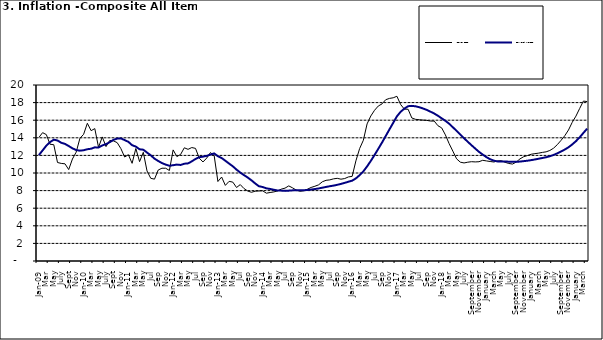
| Category | Year-on Rate | 12-Month Average |
|---|---|---|
| Jan-09 | 14.034 | 12.032 |
| Feb | 14.584 | 12.567 |
| Mar | 14.366 | 13.101 |
| Apr | 13.268 | 13.51 |
| May | 13.212 | 13.787 |
| June | 11.194 | 13.694 |
| July | 11.09 | 13.437 |
| Aug | 11.046 | 13.307 |
| Sept | 10.39 | 13.065 |
| Oct | 11.588 | 12.803 |
| Nov | 12.368 | 12.609 |
| Dec | 13.93 | 12.538 |
| Jan-10 | 14.398 | 12.586 |
| Feb | 15.649 | 12.7 |
| Mar | 14.812 | 12.757 |
| Apr | 15.044 | 12.915 |
| May | 12.915 | 12.893 |
| June | 14.099 | 13.132 |
| July | 13.002 | 13.284 |
| Aug | 13.702 | 13.5 |
| Sept | 13.65 | 13.764 |
| Oct | 13.45 | 13.908 |
| Nov | 12.766 | 13.928 |
| Dec | 11.815 | 13.74 |
| Jan-11 | 12.08 | 13.542 |
| Feb | 11.1 | 13.161 |
| Mar | 12.779 | 13.001 |
| Apr | 11.291 | 12.694 |
| May | 12.352 | 12.648 |
| Jun | 10.23 | 12.321 |
| Jul | 9.397 | 12.009 |
| Aug | 9.301 | 11.635 |
| Sep | 10.339 | 11.363 |
| Oct | 10.544 | 11.13 |
| Nov | 10.54 | 10.952 |
| Dec | 10.283 | 10.826 |
| Jan-12 | 12.626 | 10.886 |
| Feb | 11.866 | 10.955 |
| Mar | 12.111 | 10.914 |
| Apr | 12.866 | 11.054 |
| May | 12.688 | 11.096 |
| Jun | 12.892 | 11.32 |
| Jul | 12.797 | 11.599 |
| Aug | 11.689 | 11.791 |
| Sep | 11.253 | 11.859 |
| Oct | 11.693 | 11.948 |
| Nov | 12.32 | 12.091 |
| Dec | 11.981 | 12.224 |
| Jan-13 | 9.031 | 11.908 |
| Feb | 9.542 | 11.703 |
| Mar | 8.593 | 11.394 |
| Apr | 9.052 | 11.072 |
| May | 8.964 | 10.761 |
| Jun | 8.353 | 10.383 |
| Jul | 8.682 | 10.047 |
| Aug | 8.231 | 9.761 |
| Sep | 7.952 | 9.486 |
| Oct | 7.807 | 9.167 |
| Nov | 7.931 | 8.815 |
| Dec | 7.957 | 8.496 |
| Jan-14 | 7.977 | 8.408 |
| Feb | 7.707 | 8.257 |
| Mar | 7.783 | 8.19 |
| Apr | 7.851 | 8.092 |
| May | 7.965 | 8.012 |
| Jun | 8.167 | 7.998 |
| Jul | 8.281 | 7.968 |
| Aug | 8.534 | 7.996 |
| Sep | 8.317 | 8.027 |
| Oct | 8.06 | 8.047 |
| Nov | 7.927 | 8.046 |
| Dec | 7.978 | 8.047 |
| Jan-15 | 8.157 | 8.063 |
| Feb | 8.359 | 8.117 |
| Mar | 8.494 | 8.176 |
| Apr | 8.655 | 8.243 |
| May | 9.003 | 8.331 |
| Jun | 9.168 | 8.417 |
| Jul | 9.218 | 8.497 |
| Aug | 9.336 | 8.566 |
| Sep | 9.394 | 8.658 |
| Oct | 9.296 | 8.76 |
| Nov | 9.368 | 8.879 |
| Dec | 9.554 | 9.009 |
| Jan-16 | 9.617 | 9.13 |
| Feb | 11.379 | 9.386 |
| Mar | 12.775 | 9.751 |
| Apr | 13.721 | 10.182 |
| May | 15.577 | 10.746 |
| Jun | 16.48 | 11.372 |
| Jul | 17.127 | 12.045 |
| Aug | 17.609 | 12.744 |
| Sep | 17.852 | 13.454 |
| Oct | 18.33 | 14.206 |
| Nov | 18.476 | 14.958 |
| Dec | 18.547 | 15.697 |
| Jan-17 | 18.719 | 16.441 |
| Feb | 17.78 | 16.958 |
| Mar | 17.256 | 17.315 |
| Apr | 17.244 | 17.591 |
| May | 16.251 | 17.628 |
| Jun | 16.098 | 17.578 |
| Jul | 16.053 | 17.475 |
| Aug | 16.012 | 17.331 |
| Sep | 15.979 | 17.17 |
| Oct | 15.905 | 16.968 |
| Nov | 15.901 | 16.76 |
| Dec | 15.372 | 16.502 |
| Jan-18 | 15.127 | 16.215 |
| Feb | 14.33 | 15.93 |
| Mar | 13.337 | 15.599 |
| Apr | 12.482 | 15.196 |
| May | 11.608 | 14.793 |
| June | 11.231 | 14.371 |
| July | 11.142 | 13.95 |
| August | 11.227 | 13.546 |
| September | 11.284 | 13.157 |
| October | 11.259 | 12.777 |
| November | 11.281 | 12.406 |
| December | 11.442 | 12.095 |
| January | 11.374 | 11.801 |
| February | 11.306 | 11.564 |
| March | 11.251 | 11.401 |
| April | 11.372 | 11.314 |
| May | 11.396 | 11.299 |
| June | 11.217 | 11.297 |
| July | 11.084 | 11.291 |
| August | 11.016 | 11.271 |
| September | 11.244 | 11.268 |
| October | 11.607 | 11.298 |
| November | 11.854 | 11.348 |
| December | 11.982 | 11.396 |
| January | 12.132 | 11.462 |
| February | 12.199 | 11.539 |
| March | 12.257 | 11.624 |
| April | 12.341 | 11.706 |
| May | 12.404 | 11.791 |
| June | 12.559 | 11.904 |
| July | 12.821 | 12.049 |
| August | 13.22 | 12.233 |
| September | 13.707 | 12.44 |
| October | 14.233 | 12.664 |
| November | 14.887 | 12.923 |
| December | 15.753 | 13.246 |
| January | 16.466 | 13.616 |
| February | 17.335 | 14.053 |
| March | 18.171 | 14.554 |
| April | 18.117 | 15.039 |